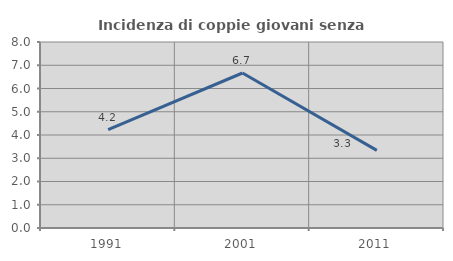
| Category | Incidenza di coppie giovani senza figli |
|---|---|
| 1991.0 | 4.23 |
| 2001.0 | 6.667 |
| 2011.0 | 3.337 |